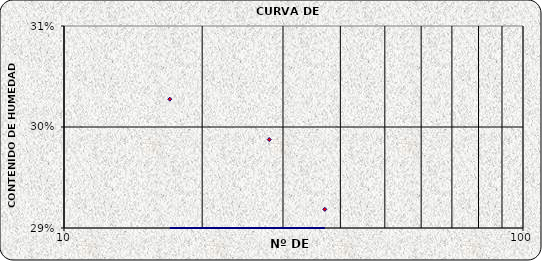
| Category | Series 0 |
|---|---|
| 37.0 | 0.292 |
| 28.0 | 0.299 |
| 17.0 | 0.303 |